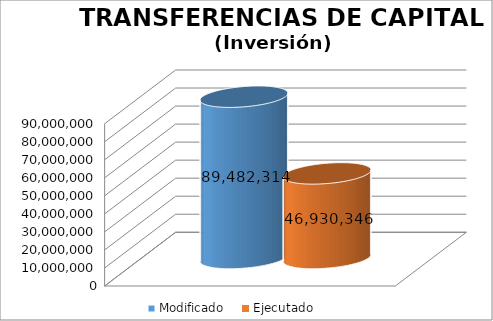
| Category | Modificado | Ejecutado |
|---|---|---|
| 0 | 89482314 | 46930345.8 |